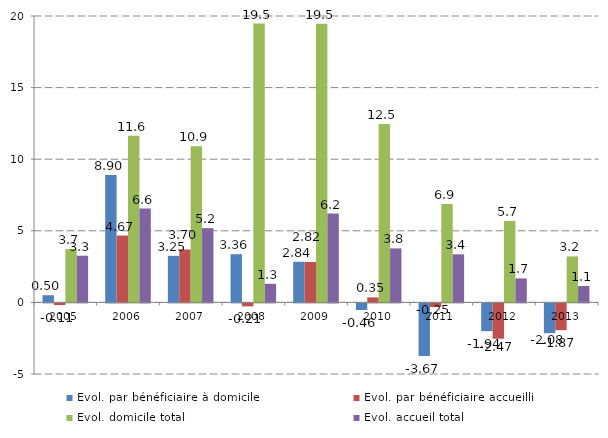
| Category | Evol. par bénéficiaire à domicile | Evol. par bénéficiaire accueilli | Evol. domicile total | Evol. accueil total |
|---|---|---|---|---|
| 2005.0 | 0.502 | -0.115 | 3.72 | 3.26 |
| 2006.0 | 8.904 | 4.669 | 11.637 | 6.554 |
| 2007.0 | 3.253 | 3.695 | 10.905 | 5.186 |
| 2008.0 | 3.363 | -0.208 | 19.476 | 1.302 |
| 2009.0 | 2.838 | 2.824 | 19.455 | 6.2 |
| 2010.0 | -0.459 | 0.351 | 12.463 | 3.773 |
| 2011.0 | -3.672 | -0.247 | 6.87 | 3.358 |
| 2012.0 | -1.939 | -2.467 | 5.684 | 1.676 |
| 2013.0 | -2.078 | -1.868 | 3.211 | 1.146 |